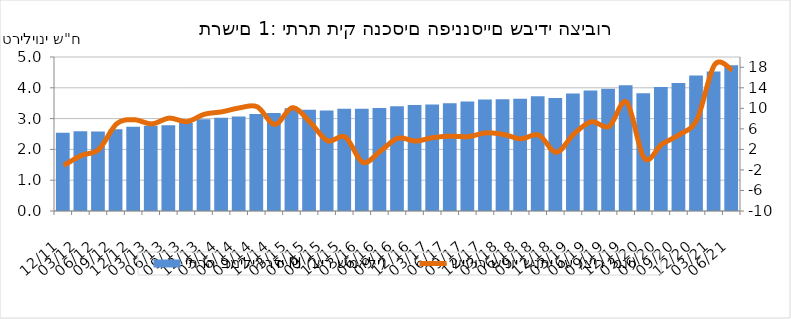
| Category | יתרה במיליארדי ₪ (ציר שמאלי)  |
|---|---|
| 2011-12-31 | 2536.6 |
| 2012-03-31 | 2590.15 |
| 2012-06-30 | 2577.25 |
| 2012-09-30 | 2658 |
| 2012-12-31 | 2734.05 |
| 2013-03-31 | 2770.65 |
| 2013-06-30 | 2785.83 |
| 2013-09-30 | 2854.98 |
| 2013-12-31 | 2976.17 |
| 2014-03-31 | 3029.16 |
| 2014-06-30 | 3067.13 |
| 2014-09-30 | 3148.91 |
| 2014-12-31 | 3180.21 |
| 2015-03-31 | 3336.08 |
| 2015-06-30 | 3290.87 |
| 2015-09-30 | 3264.57 |
| 2015-12-31 | 3320.77 |
| 2016-03-31 | 3318.43 |
| 2016-06-30 | 3346.1 |
| 2016-09-30 | 3401.34 |
| 2016-12-31 | 3440.94 |
| 2017-03-31 | 3461.46 |
| 2017-06-30 | 3499.36 |
| 2017-09-30 | 3553.83 |
| 2017-12-31 | 3620.29 |
| 2018-03-31 | 3631.57 |
| 2018-06-30 | 3641.24 |
| 2018-09-30 | 3724.42 |
| 2018-12-31 | 3672.3 |
| 2019-03-31 | 3813.75 |
| 2019-06-30 | 3910.67 |
| 2019-09-30 | 3965.16 |
| 2019-12-31 | 4083.29 |
| 2020-03-31 | 3824.57 |
| 2020-06-30 | 4028.03 |
| 2020-09-30 | 4158.97 |
| 2020-12-31 | 4403.18 |
| 2021-03-31 | 4531.99 |
| 2021-06-30 | 4731.51 |